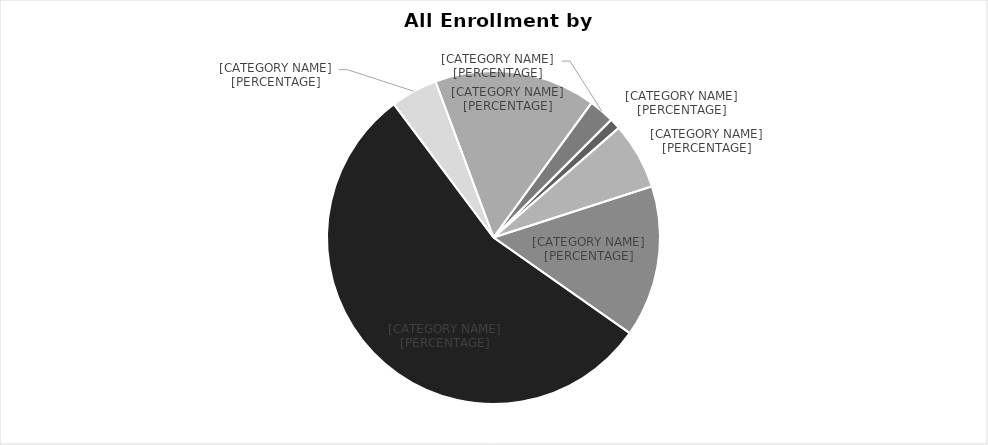
| Category | Series 0 |
|---|---|
| No College Designated | 75 |
| College of Business | 459 |
| College of Computing | 1043 |
| College of Engineering | 3903 |
| College Forest Resources & Envr Sci | 322 |
| College of Sciences & Arts | 1112 |
| Interdisciplinary | 176 |